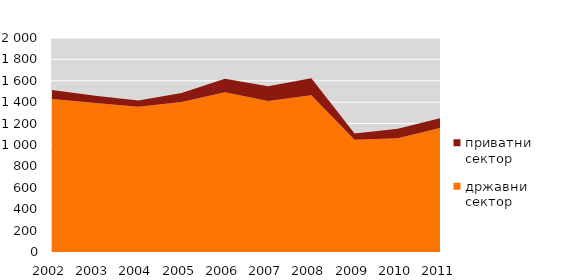
| Category | државни сектор | приватни сектор |
|---|---|---|
| 2002.0 | 1431 | 83 |
| 2003.0 | 1392 | 69 |
| 2004.0 | 1358 | 58 |
| 2005.0 | 1403 | 84 |
| 2006.0 | 1494 | 124 |
| 2007.0 | 1411 | 138 |
| 2008.0 | 1466 | 158 |
| 2009.0 | 1048 | 60 |
| 2010.0 | 1063 | 89 |
| 2011.0 | 1161 | 92 |